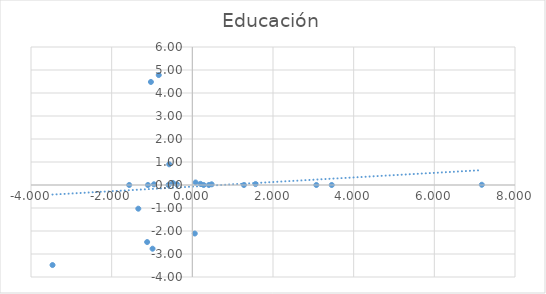
| Category | Educación |
|---|---|
| 0.06052582200249956 | -2.11 |
| -1.339539147515001 | -1.03 |
| -1.1203229332582998 | -2.48 |
| -0.9862037445886013 | -2.77 |
| -3.4662710747771994 | -3.48 |
| 0.4103518494638997 | 0 |
| -1.5653149541481977 | 0 |
| 1.5673496706761991 | 0.04 |
| 7.1770364527009995 | 0.01 |
| 0.47884246635880034 | 0.03 |
| -0.832734952533401 | 4.78 |
| 3.4562493478376117 | 0 |
| 0.28079979651694786 | 0 |
| -0.5906758229193689 | 0 |
| -0.38208630553888956 | 0.03 |
| -0.5726169698249004 | 0.9 |
| 0.08025158798270066 | 0.11 |
| 1.2789830493301095 | 0 |
| -1.1005497828799102 | 0 |
| 0.20330044603610042 | 0.05 |
| -0.48222478231940147 | 0.09 |
| -0.9518304220709997 | 0.03 |
| -1.027059621055 | 4.48 |
| 3.074367518631871 | 0 |